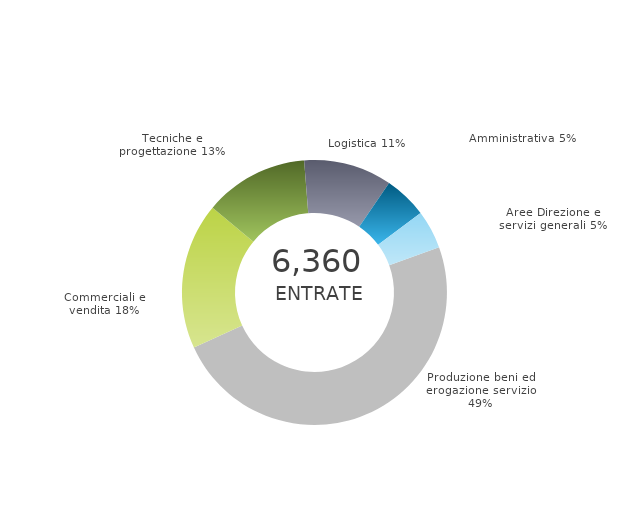
| Category | Series 0 | Series 1 |
|---|---|---|
| Produzione beni ed erogazione servizio | 0 | 0.487 |
| Commerciali e vendita | 0 | 0.178 |
| Tecniche e progettazione | 0 | 0.127 |
| Logistica | 0 | 0.108 |
| Amministrativa | 0 | 0.053 |
| Aree Direzione e servizi generali | 0 | 0.047 |